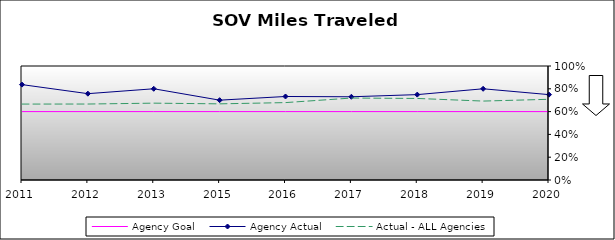
| Category | Agency Goal | Agency Actual | Actual - ALL Agencies |
|---|---|---|---|
| 2011.0 | 0.6 | 0.837 | 0.666 |
| 2012.0 | 0.6 | 0.757 | 0.666 |
| 2013.0 | 0.6 | 0.8 | 0.674 |
| 2015.0 | 0.6 | 0.7 | 0.668 |
| 2016.0 | 0.6 | 0.732 | 0.679 |
| 2017.0 | 0.6 | 0.73 | 0.719 |
| 2018.0 | 0.6 | 0.749 | 0.715 |
| 2019.0 | 0.6 | 0.8 | 0.692 |
| 2020.0 | 0.6 | 0.749 | 0.708 |